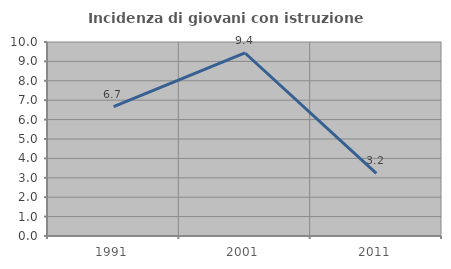
| Category | Incidenza di giovani con istruzione universitaria |
|---|---|
| 1991.0 | 6.667 |
| 2001.0 | 9.434 |
| 2011.0 | 3.226 |